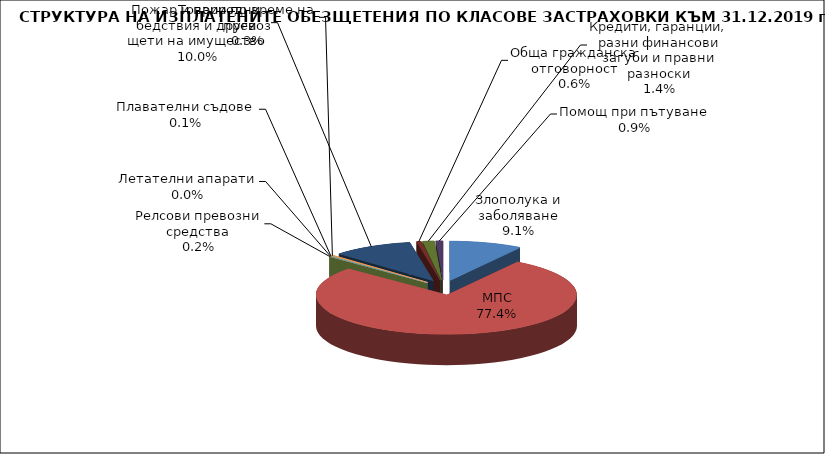
| Category | Злополука и заболяване |
|---|---|
| Злополука и заболяване | 0.091 |
| МПС | 0.774 |
| Релсови превозни средства | 0.002 |
| Летателни апарати | 0 |
| Плавателни съдове | 0.001 |
| Товари по време на превоз | 0.003 |
| Пожар и природни бедствия и други щети на имущество | 0.1 |
| Обща гражданска отговорност | 0.006 |
| Кредити, гаранции, разни финансови загуби и правни разноски | 0.014 |
| Помощ при пътуване | 0.009 |